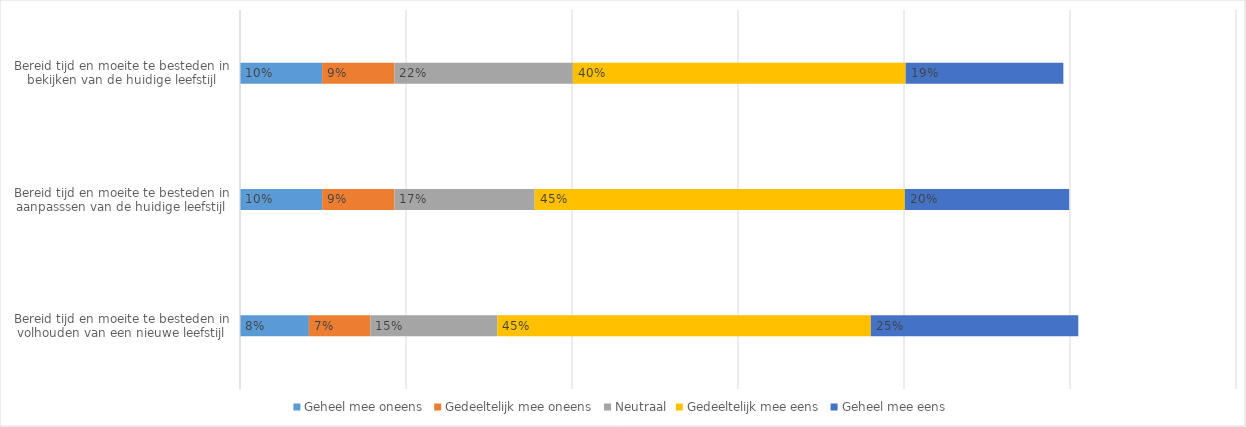
| Category | Geheel mee oneens | Gedeeltelijk mee oneens | Neutraal | Gedeeltelijk mee eens | Geheel mee eens |
|---|---|---|---|---|---|
| Bereid tijd en moeite te besteden in volhouden van een nieuwe leefstijl | 0.083 | 0.074 | 0.153 | 0.45 | 0.25 |
| Bereid tijd en moeite te besteden in aanpasssen van de huidige leefstijl | 0.099 | 0.087 | 0.169 | 0.446 | 0.198 |
| Bereid tijd en moeite te besteden in bekijken van de huidige leefstijl | 0.099 | 0.087 | 0.215 | 0.401 | 0.19 |